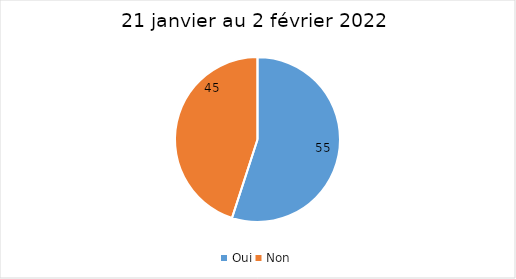
| Category | Series 0 |
|---|---|
| Oui | 55 |
| Non | 45 |